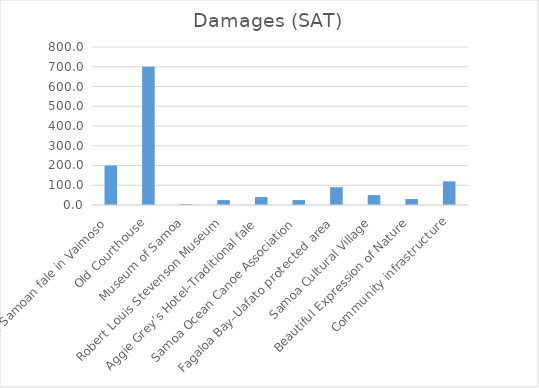
| Category | Damage |
|---|---|
| Traditional Samoan fale in Vaimoso | 200 |
| Old Courthouse | 700 |
| Museum of Samoa | 4 |
| Robert Louis Stevenson Museum | 25 |
| Aggie Grey’s Hotel–Traditional fale | 40 |
| Samoa Ocean Canoe Association | 25 |
| Fagaloa Bay–Uafato protected area | 90 |
| Samoa Cultural Village | 50 |
| Beautiful Expression of Nature | 30 |
| Community infrastructure | 120 |